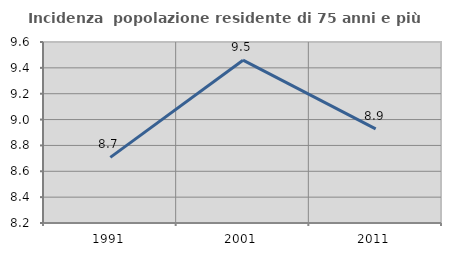
| Category | Incidenza  popolazione residente di 75 anni e più |
|---|---|
| 1991.0 | 8.708 |
| 2001.0 | 9.459 |
| 2011.0 | 8.928 |